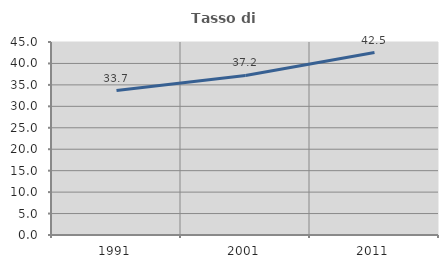
| Category | Tasso di occupazione   |
|---|---|
| 1991.0 | 33.674 |
| 2001.0 | 37.202 |
| 2011.0 | 42.536 |